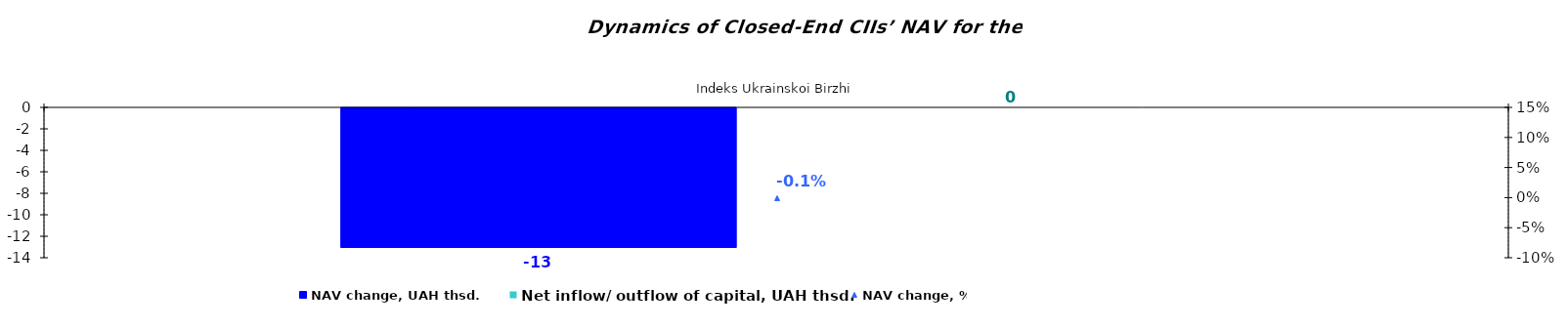
| Category | NAV change, UAH thsd. | Net inflow/ outflow of capital, UAH thsd. |
|---|---|---|
| Іndeks Ukrainskoi Birzhi | -12.996 | 0 |